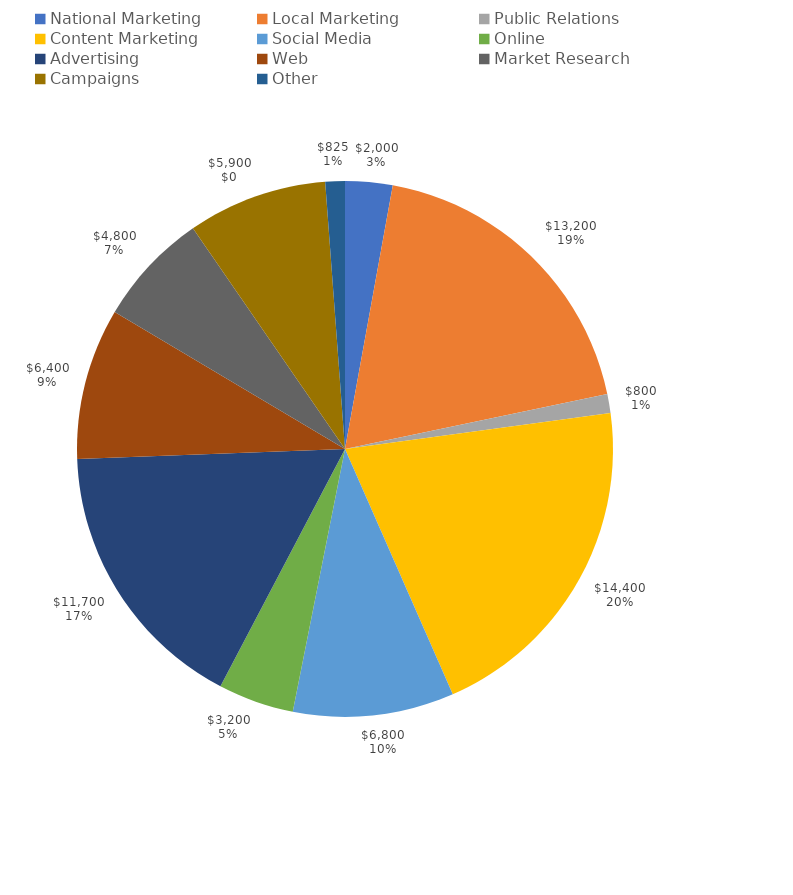
| Category | Series 0 | Series 1 |
|---|---|---|
| National Marketing | 2000 | 0.029 |
| Local Marketing | 13200 | 0.189 |
| Public Relations | 800 | 0.011 |
| Content Marketing | 14400 | 0.206 |
| Social Media | 6800 | 0.097 |
| Online | 3200 | 0.046 |
| Advertising | 11700 | 0.167 |
| Web | 6400 | 0.091 |
| Market Research | 4800 | 0.069 |
| Campaigns | 5900 | 0.084 |
| Other | 825 | 0.012 |